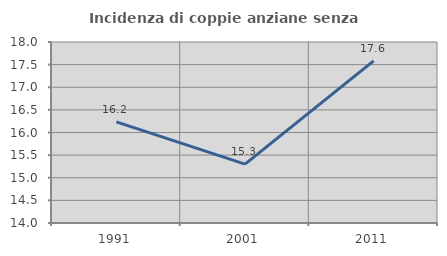
| Category | Incidenza di coppie anziane senza figli  |
|---|---|
| 1991.0 | 16.234 |
| 2001.0 | 15.3 |
| 2011.0 | 17.582 |